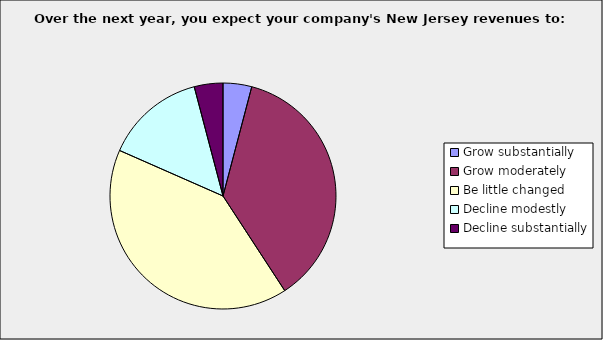
| Category | Series 0 |
|---|---|
| Grow substantially | 0.041 |
| Grow moderately | 0.367 |
| Be little changed | 0.408 |
| Decline modestly | 0.143 |
| Decline substantially | 0.041 |